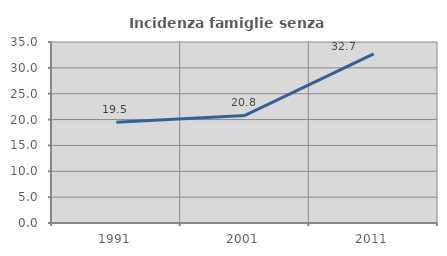
| Category | Incidenza famiglie senza nuclei |
|---|---|
| 1991.0 | 19.461 |
| 2001.0 | 20.795 |
| 2011.0 | 32.72 |